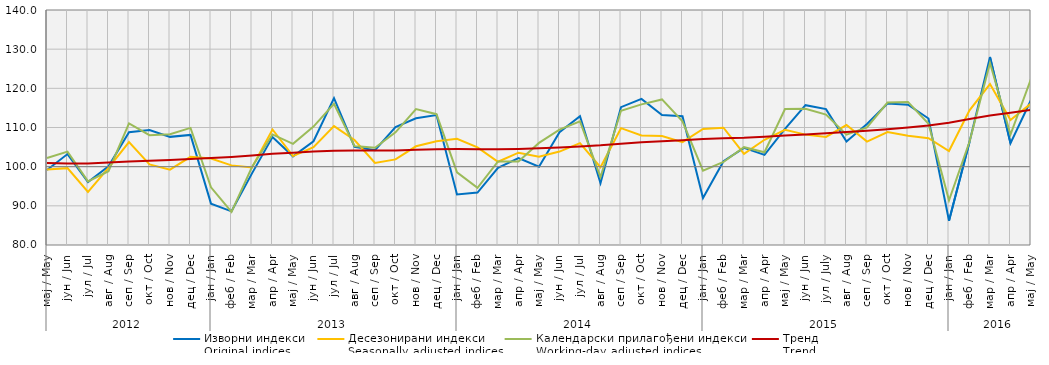
| Category | Изворни индекси
Original indices | Десезонирани индекси
Seasonally adjusted indices | Календарски прилагођени индекси
Working-day adjusted indices | Тренд
Trend |
|---|---|---|---|---|
| 0 | 99.133 | 99.294 | 102.22 | 100.916 |
| 1 | 103.214 | 99.623 | 103.849 | 100.82 |
| 2 | 96.046 | 93.542 | 96.243 | 100.819 |
| 3 | 100.071 | 99.663 | 98.851 | 101.049 |
| 4 | 108.809 | 106.27 | 111.056 | 101.34 |
| 5 | 109.371 | 100.575 | 108.038 | 101.499 |
| 6 | 107.609 | 99.246 | 108.271 | 101.677 |
| 7 | 108.112 | 102.498 | 109.895 | 101.94 |
| 8 | 90.559 | 102.095 | 94.725 | 102.206 |
| 9 | 88.596 | 100.326 | 88.452 | 102.471 |
| 10 | 98.288 | 99.811 | 99.908 | 102.845 |
| 11 | 107.567 | 109.501 | 108.228 | 103.271 |
| 12 | 102.635 | 102.702 | 105.832 | 103.569 |
| 13 | 106.478 | 105.001 | 110.244 | 103.846 |
| 14 | 117.488 | 110.365 | 116.055 | 104.091 |
| 15 | 105.073 | 106.799 | 105.289 | 104.136 |
| 16 | 104.198 | 100.955 | 104.839 | 104.096 |
| 17 | 110.096 | 101.86 | 108.754 | 104.157 |
| 18 | 112.368 | 105.204 | 114.689 | 104.307 |
| 19 | 113.169 | 106.493 | 113.401 | 104.437 |
| 20 | 92.9 | 107.115 | 98.534 | 104.497 |
| 21 | 93.4 | 104.92 | 94.601 | 104.472 |
| 22 | 99.7 | 101.253 | 101.326 | 104.452 |
| 23 | 102.2 | 103.574 | 101.324 | 104.53 |
| 24 | 100 | 102.553 | 106.064 | 104.673 |
| 25 | 108.8 | 103.851 | 109.475 | 104.898 |
| 26 | 112.9 | 106.004 | 111.568 | 105.148 |
| 27 | 95.8 | 99.887 | 97.36 | 105.442 |
| 28 | 115.2 | 109.826 | 114.282 | 105.861 |
| 29 | 117.3 | 107.944 | 115.899 | 106.228 |
| 30 | 113.2 | 107.81 | 117.171 | 106.502 |
| 31 | 112.9 | 106.271 | 111.564 | 106.766 |
| 32 | 92 | 109.613 | 98.996 | 107.034 |
| 33 | 101.4 | 109.942 | 101.195 | 107.225 |
| 34 | 104.8 | 103.251 | 104.969 | 107.363 |
| 35 | 103 | 106.862 | 103.677 | 107.62 |
| 36 | 109.651 | 109.43 | 114.695 | 107.937 |
| 37 | 115.698 | 108.181 | 114.755 | 108.213 |
| 38 | 114.7 | 107.594 | 113.282 | 108.513 |
| 39 | 106.4 | 110.627 | 108.182 | 108.832 |
| 40 | 110.9 | 106.389 | 110.021 | 109.147 |
| 41 | 116.1 | 108.841 | 116.372 | 109.533 |
| 42 | 115.8 | 107.906 | 116.527 | 109.996 |
| 43 | 112.3 | 107.264 | 110.937 | 110.528 |
| 44 | 86.2 | 103.983 | 91.416 | 111.235 |
| 45 | 106.3 | 114.391 | 106.369 | 112.184 |
| 46 | 128 | 121.083 | 126.45 | 113.083 |
| 47 | 106 | 111.917 | 108.179 | 113.781 |
| 48 | 117 | 116.11 | 122.408 | 114.495 |